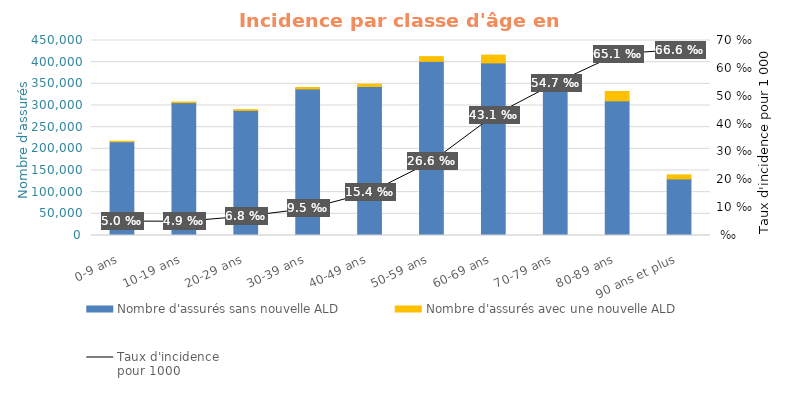
| Category | Nombre d'assurés sans nouvelle ALD | Nombre d'assurés avec une nouvelle ALD |
|---|---|---|
| 0-9 ans | 216418.5 | 1086 |
| 10-19 ans | 306578 | 1525 |
| 20-29 ans | 288545 | 1982 |
| 30-39 ans | 338234.5 | 3261 |
| 40-49 ans | 343877 | 5387 |
| 50-59 ans | 401837.5 | 10973 |
| 60-69 ans | 398258 | 17937 |
| 70-79 ans | 332388 | 19237 |
| 80-89 ans | 310755 | 21626 |
| 90 ans et plus | 130534 | 9312 |